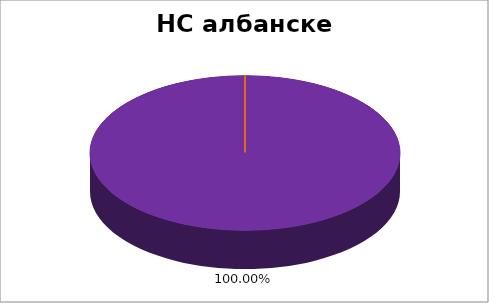
| Category | НС албанске НМ |
|---|---|
| 0 | 0 |
| 1 | 0 |
| 2 | 0 |
| 3 | 0 |
| 4 | 1 |